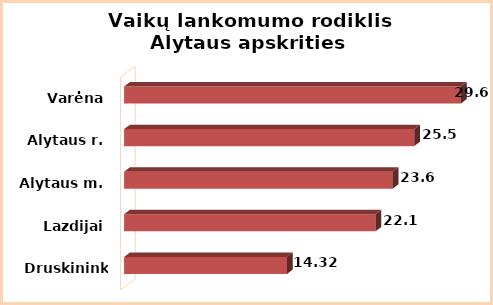
| Category | Series 0 |
|---|---|
| Druskininkai | 14.32 |
| Lazdijai | 22.1 |
| Alytaus m. | 23.6 |
| Alytaus r. | 25.5 |
| Varėna | 29.6 |